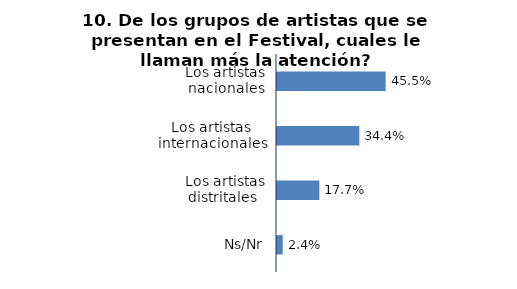
| Category | Series 0 |
|---|---|
| Los artistas nacionales | 0.455 |
| Los artistas internacionales | 0.344 |
| Los artistas distritales  | 0.177 |
| Ns/Nr | 0.024 |